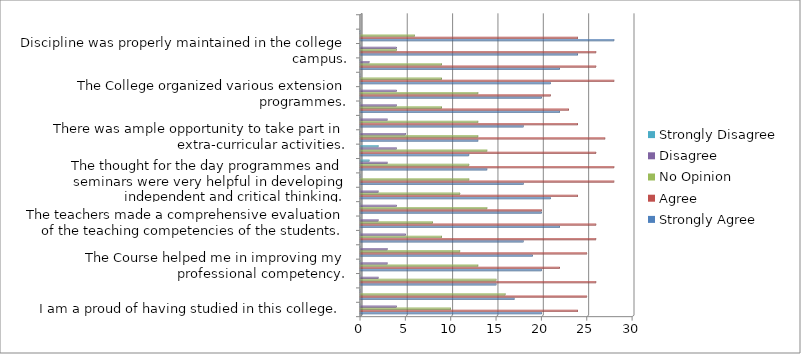
| Category | Strongly Agree  | Agree | No Opinion  | Disagree | Strongly Disagree  |
|---|---|---|---|---|---|
| I am a proud of having studied in this college. | 20 | 24 | 10 | 4 | 0 |
| There existed cordial relation between the staff and students.  | 17 | 25 | 16 | 0 | 0 |
| The institution helped me to fulfill my ambition of becoming a teacher. | 15 | 26 | 15 | 2 | 0 |
| The Course helped me in improving my professional competency. | 20 | 22 | 13 | 3 | 0 |
| The internal assessment of this college is balanced and objective. | 19 | 25 | 11 | 3 | 0 |
| The library facilities are adequate. | 18 | 26 | 9 | 5 | 0 |
| The teachers made a comprehensive evaluation of the teaching competencies of the students. | 22 | 26 | 8 | 2 | 0 |
| The teachers devoted extra time to render guidance. | 20 | 20 | 14 | 4 | 0 |
| Teacher adopted several innovative practices while teaching. | 21 | 24 | 11 | 2 | 0 |
| The thought for the day programmes and seminars were very helpful in developing independent and critical thinking. | 18 | 28 | 12 | 0 | 0 |
| The infrastructure facilities were adequate. | 14 | 28 | 12 | 3 | 1 |
| The educational tour proved to be informative. | 12 | 26 | 14 | 4 | 2 |
| There was ample opportunity to take part in extra-curricular activities. | 13 | 27 | 13 | 5 | 0 |
|  | 18 | 24 | 13 | 3 | 0 |
| There are adequate facilities for physical training and games. | 22 | 23 | 9 | 4 | 0 |
| The College organized various extension programmes. | 20 | 21 | 13 | 4 | 0 |
| The organization of various clubs in the college encouraged me to develop my intellectual and social skill. | 21 | 28 | 9 | 0 | 0 |
| Top Scores in the University Examination are felicitated. | 22 | 26 | 9 | 1 | 0 |
| Discipline was properly maintained in the college campus. | 24 | 26 | 4 | 4 | 0 |
| I often cherished glorious moments of my life in the college. | 28 | 24 | 6 | 0 | 0 |